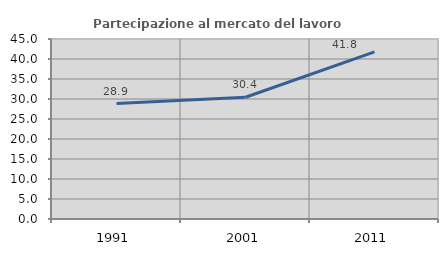
| Category | Partecipazione al mercato del lavoro  femminile |
|---|---|
| 1991.0 | 28.866 |
| 2001.0 | 30.435 |
| 2011.0 | 41.772 |